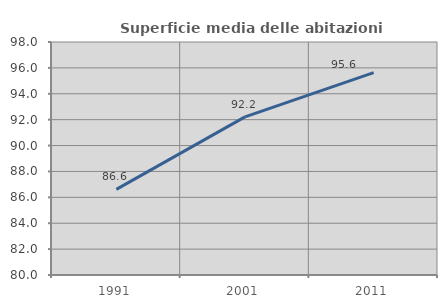
| Category | Superficie media delle abitazioni occupate |
|---|---|
| 1991.0 | 86.612 |
| 2001.0 | 92.22 |
| 2011.0 | 95.635 |